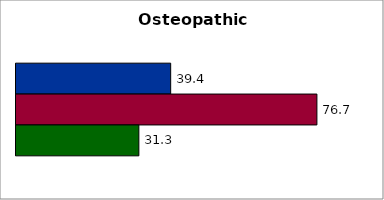
| Category | 50 states and D.C. | SREB states | State |
|---|---|---|---|
| 0 | 39.437 | 76.719 | 31.325 |